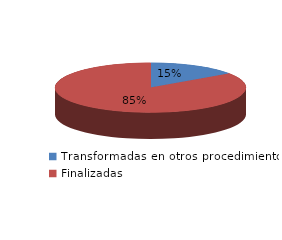
| Category | Series 0 |
|---|---|
| Transformadas en otros procedimientos | 2898 |
| Finalizadas | 16154 |